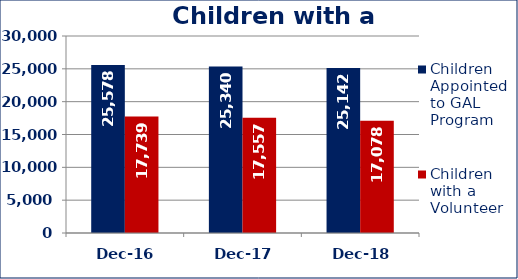
| Category | Children Appointed to GAL Program  | Children with a Volunteer  |
|---|---|---|
| Dec-16 | 25578 | 17739 |
| Dec-17 | 25340 | 17557 |
| Dec-18 | 25142 | 17078 |